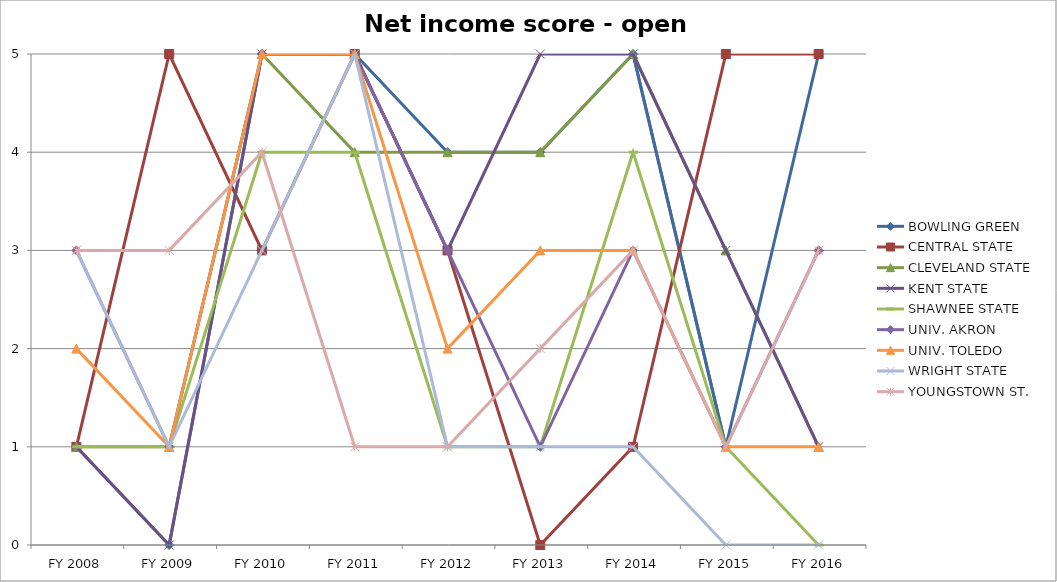
| Category | BOWLING GREEN  | CENTRAL STATE  | CLEVELAND STATE  | KENT STATE  | SHAWNEE STATE  | UNIV. AKRON  | UNIV. TOLEDO  | WRIGHT STATE  | YOUNGSTOWN ST.  |
|---|---|---|---|---|---|---|---|---|---|
| FY 2016 | 5 | 5 | 1 | 1 | 0 | 3 | 1 | 0 | 3 |
| FY 2015 | 1 | 5 | 3 | 3 | 1 | 1 | 1 | 0 | 1 |
| FY 2014 | 5 | 1 | 5 | 5 | 4 | 3 | 3 | 1 | 3 |
| FY 2013 | 4 | 0 | 4 | 5 | 1 | 1 | 3 | 1 | 2 |
| FY 2012 | 4 | 3 | 4 | 3 | 1 | 3 | 2 | 1 | 1 |
| FY 2011 | 5 | 5 | 4 | 5 | 4 | 5 | 5 | 5 | 1 |
| FY 2010 | 5 | 3 | 5 | 5 | 4 | 5 | 5 | 3 | 4 |
| FY 2009 | 0 | 5 | 1 | 0 | 1 | 1 | 1 | 1 | 3 |
| FY 2008 | 1 | 1 | 1 | 1 | 1 | 3 | 2 | 3 | 3 |